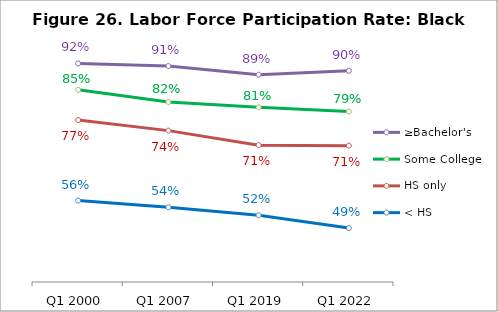
| Category | ≥Bachelor's | Some College | HS only | < HS |
|---|---|---|---|---|
| Q1 2000 | 0.92 | 0.851 | 0.772 | 0.562 |
| Q1 2007 | 0.913 | 0.82 | 0.745 | 0.545 |
| Q1 2019 | 0.891 | 0.806 | 0.707 | 0.524 |
| Q1 2022 | 0.901 | 0.795 | 0.706 | 0.491 |